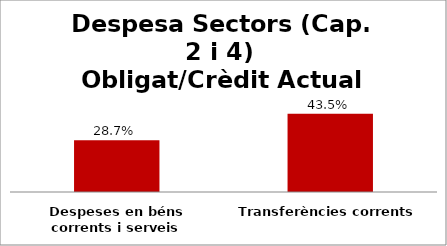
| Category | Series 0 |
|---|---|
| Despeses en béns corrents i serveis | 0.287 |
| Transferències corrents | 0.435 |